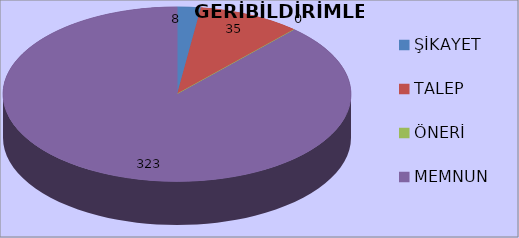
| Category | ADET |
|---|---|
| ŞİKAYET | 8 |
| TALEP | 35 |
| ÖNERİ | 0 |
| MEMNUN | 323 |